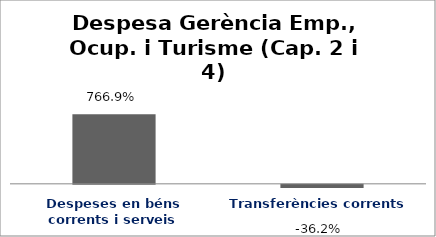
| Category | Series 0 |
|---|---|
| Despeses en béns corrents i serveis | 7.669 |
| Transferències corrents | -0.362 |